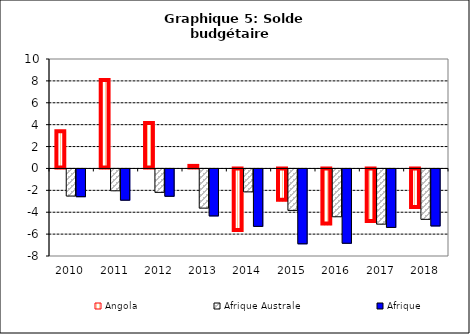
| Category | Angola | Afrique Australe | Afrique |
|---|---|---|---|
| 2010.0 | 3.389 | -2.477 | -2.535 |
| 2011.0 | 8.075 | -1.995 | -2.853 |
| 2012.0 | 4.144 | -2.14 | -2.495 |
| 2013.0 | 0.233 | -3.581 | -4.291 |
| 2014.0 | -5.719 | -2.096 | -5.245 |
| 2015.0 | -2.952 | -3.788 | -6.84 |
| 2016.0 | -5.122 | -4.368 | -6.79 |
| 2017.0 | -4.89 | -5.043 | -5.342 |
| 2018.0 | -3.611 | -4.606 | -5.208 |